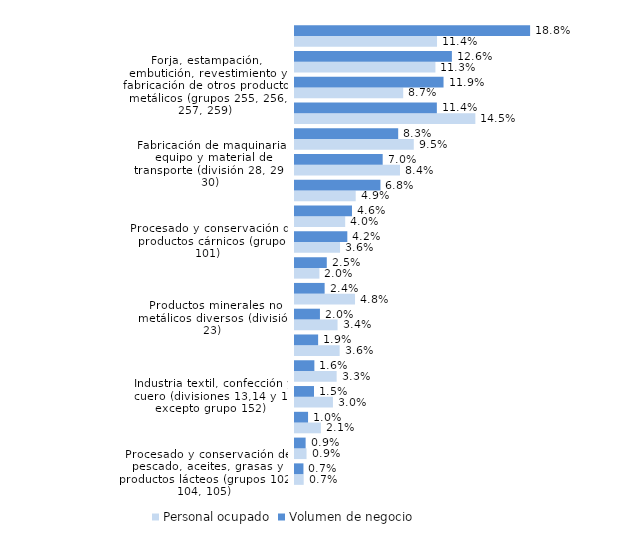
| Category | Personal ocupado | Volumen de negocio |
|---|---|---|
| Procesado y conservación de pescado, aceites, grasas y productos lácteos (grupos 102, 104, 105) | 0.007 | 0.007 |
| Fabricación de productos informáticos, eléctricos, electrónicos y ópticos (división 26 y 27) | 0.009 | 0.009 |
| Otras industrias manufactureras y reparación e instalación de maquinaria y equipo (división 32 y 33) | 0.021 | 0.01 |
| Industria textil, confección y cuero (divisiones 13,14 y 15 excepto grupo 152)  | 0.03 | 0.015 |
| Metalurgia, metales para la construcción, calderas, depósitos contenedores, armas y municiones (división 24 y grupos 251, 252, 253 y 254) | 0.033 | 0.016 |
| Papel, artes gráficas y reproducción de soportes grabados (división 17 y 18) | 0.036 | 0.019 |
| Productos minerales no metálicos diversos (división 23) | 0.034 | 0.02 |
| Fabricación de muebles (división 31) | 0.048 | 0.024 |
| Coquerías y refino de petróleo, industria química y farmacéutica (división 19, 20 y 21) | 0.02 | 0.025 |
| Procesado y conservación de productos cárnicos (grupo 101) | 0.036 | 0.042 |
| Industria de la madera y del corcho, excepto muebles; cestería y espartería (división 16) | 0.04 | 0.046 |
| Procesado y conservación de frutas y hortalizas (grupo 103) | 0.049 | 0.068 |
| Fabricación de maquinaria, equipo y material de transporte (división 28, 29 y 30) | 0.084 | 0.07 |
| Caucho y materias plásticas (división 22) | 0.095 | 0.083 |
| Fabricación de calzado (grupo 152) | 0.145 | 0.114 |
| Forja, estampación, embutición, revestimiento y fabricación de otros productos metálicos (grupos 255, 256, 257, 259) | 0.087 | 0.119 |
| Otras industrias alimenticias, tabaco y bebidas excepto elaboración de vinos (grupos 106, 107, 108, 109, división 12 y división 11 excepto clase 1102) | 0.113 | 0.126 |
| Elaboración de vinos (clase 1102) | 0.114 | 0.188 |